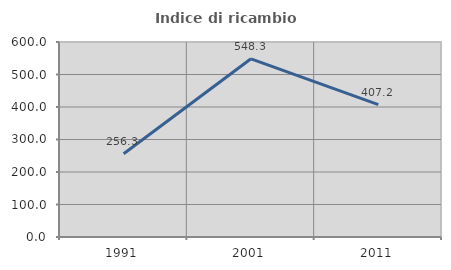
| Category | Indice di ricambio occupazionale  |
|---|---|
| 1991.0 | 256.25 |
| 2001.0 | 548.276 |
| 2011.0 | 407.229 |